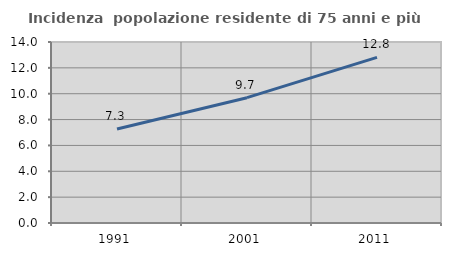
| Category | Incidenza  popolazione residente di 75 anni e più |
|---|---|
| 1991.0 | 7.265 |
| 2001.0 | 9.694 |
| 2011.0 | 12.813 |